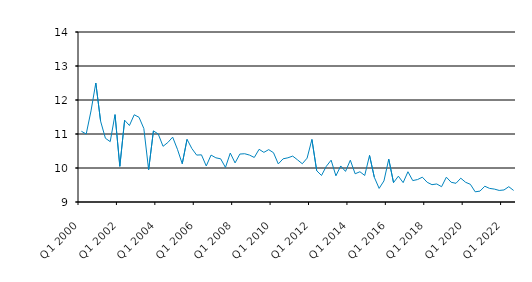
| Category | Series 0 |
|---|---|
| Q1 2000 | 11.08 |
| Q2 2000 | 11 |
| Q3 2000 | 11.679 |
| Q4 2000 | 12.5 |
| Q1 2001 | 11.375 |
| Q2 2001 | 10.875 |
| Q3 2001 | 10.775 |
| Q4 2001 | 11.57 |
| Q1 2002 | 10.05 |
| Q2 2002 | 11.405 |
| Q3 2002 | 11.25 |
| Q4 2002 | 11.566 |
| Q1 2003 | 11.492 |
| Q2 2003 | 11.162 |
| Q3 2003 | 9.95 |
| Q4 2003 | 11.091 |
| Q1 2004 | 11 |
| Q2 2004 | 10.638 |
| Q3 2004 | 10.75 |
| Q4 2004 | 10.908 |
| Q1 2005 | 10.55 |
| Q2 2005 | 10.125 |
| Q3 2005 | 10.843 |
| Q4 2005 | 10.573 |
| Q1 2006 | 10.38 |
| Q2 2006 | 10.387 |
| Q3 2006 | 10.06 |
| Q4 2006 | 10.38 |
| Q1 2007 | 10.3 |
| Q2 2007 | 10.27 |
| Q3 2007 | 10.017 |
| Q4 2007 | 10.44 |
| Q1 2008 | 10.15 |
| Q2 2008 | 10.41 |
| Q3 2008 | 10.42 |
| Q4 2008 | 10.38 |
| Q1 2009 | 10.31 |
| Q2 2009 | 10.55 |
| Q3 2009 | 10.46 |
| Q4 2009 | 10.54 |
| Q1 2010 | 10.45 |
| Q2 2010 | 10.12 |
| Q3 2010 | 10.27 |
| Q4 2010 | 10.3 |
| Q1 2011 | 10.35 |
| Q2 2011 | 10.24 |
| Q3 2011 | 10.125 |
| Q4 2011 | 10.29 |
| Q1 2012 | 10.84 |
| Q2 2012 | 9.92 |
| Q3 2012 | 9.78 |
| Q4 2012 | 10.05 |
| Q1 2013 | 10.23 |
| Q2 2013 | 9.77 |
| Q3 2013 | 10.06 |
| Q4 2013 | 9.9 |
| Q1 2014 | 10.23 |
| Q2 2014 | 9.83 |
| Q3 2014 | 9.89 |
| Q4 2014 | 9.78 |
| Q1 2015 | 10.37 |
| Q2 2015 | 9.726 |
| Q3 2015 | 9.4 |
| Q4 2015 | 9.62 |
| Q1 2016 | 10.26 |
| Q2 2016 | 9.57 |
| Q3 2016 | 9.76 |
| Q4 2016 | 9.57 |
| Q1 2017 | 9.89 |
| Q2 2017 | 9.63 |
| Q3 2017 | 9.66 |
| Q4 2017 | 9.73 |
| Q1 2018 | 9.58 |
| Q2 2018 | 9.51 |
| Q3 2018 | 9.53 |
| Q4 2018 | 9.45 |
| Q1 2019 | 9.73 |
| Q2 2019 | 9.58 |
| Q3 2019 | 9.55 |
| Q4 2019 | 9.7 |
| Q1 2020 | 9.58 |
| Q2 2020 | 9.52 |
| Q3 2020 | 9.3 |
| Q4 2020 | 9.32 |
| Q1 2021 | 9.464 |
| Q2 2021 | 9.4 |
| Q3 2021 | 9.38 |
| Q4 2021 | 9.34 |
| Q1 2022 | 9.354 |
| Q2 2022 | 9.45 |
| Q3 2022 | 9.34 |